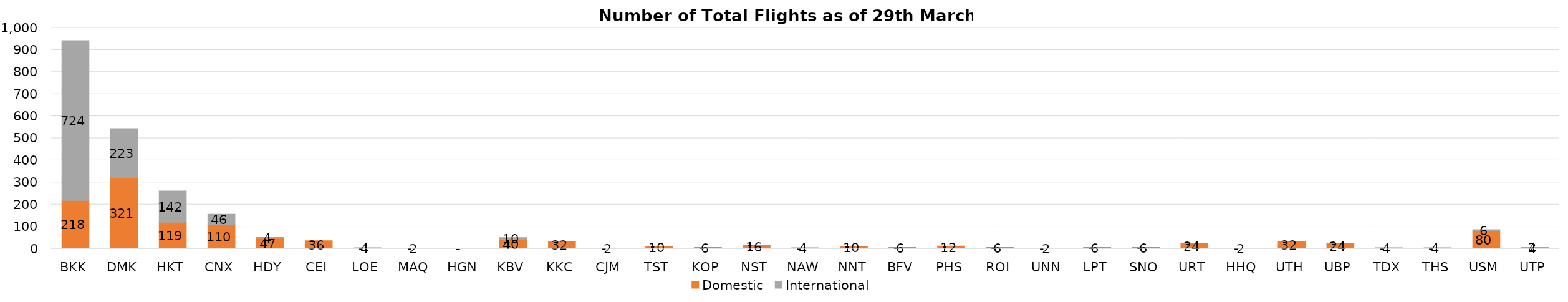
| Category | Domestic | International |
|---|---|---|
| BKK | 218 | 724 |
| DMK | 321 | 223 |
| HKT | 119 | 142 |
| CNX | 110 | 46 |
| HDY | 47 | 4 |
| CEI | 36 | 0 |
| LOE | 4 | 0 |
| MAQ | 2 | 0 |
| HGN | 0 | 0 |
| KBV | 40 | 10 |
| KKC | 32 | 0 |
| CJM | 2 | 0 |
| TST | 10 | 0 |
| KOP | 6 | 0 |
| NST | 16 | 0 |
| NAW | 4 | 0 |
| NNT | 10 | 0 |
| BFV | 6 | 0 |
| PHS | 12 | 0 |
| ROI | 6 | 0 |
| UNN | 2 | 0 |
| LPT | 6 | 0 |
| SNO | 6 | 0 |
| URT | 24 | 0 |
| HHQ | 2 | 0 |
| UTH | 32 | 0 |
| UBP | 24 | 0 |
| TDX | 4 | 0 |
| THS | 4 | 0 |
| USM | 80 | 6 |
| UTP | 4 | 2 |